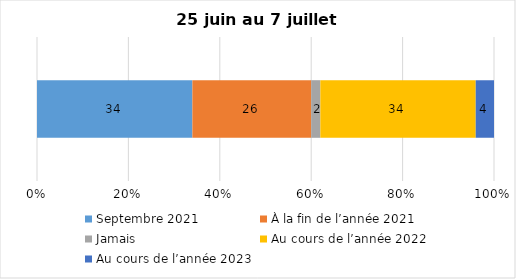
| Category | Septembre 2021 | À la fin de l’année 2021 | Jamais | Au cours de l’année 2022 | Au cours de l’année 2023 |
|---|---|---|---|---|---|
| 0 | 34 | 26 | 2 | 34 | 4 |